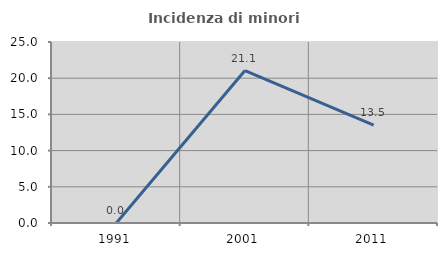
| Category | Incidenza di minori stranieri |
|---|---|
| 1991.0 | 0 |
| 2001.0 | 21.053 |
| 2011.0 | 13.504 |